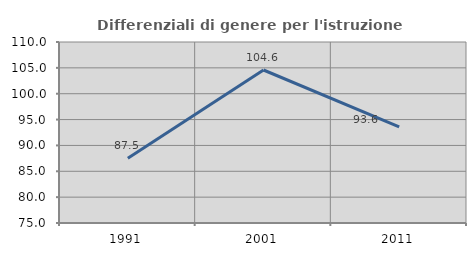
| Category | Differenziali di genere per l'istruzione superiore |
|---|---|
| 1991.0 | 87.529 |
| 2001.0 | 104.584 |
| 2011.0 | 93.582 |